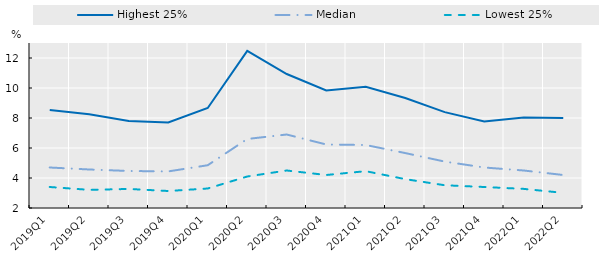
| Category | Highest 25% | Median | Lowest 25% |
|---|---|---|---|
| 2019Q1 | 8.53 | 4.7 | 3.4 |
| 2019Q2 | 8.244 | 4.567 | 3.21 |
| 2019Q3 | 7.8 | 4.468 | 3.27 |
| 2019Q4 | 7.7 | 4.439 | 3.133 |
| 2020Q1 | 8.669 | 4.852 | 3.3 |
| 2020Q2 | 12.479 | 6.602 | 4.1 |
| 2020Q3 | 10.934 | 6.9 | 4.5 |
| 2020Q4 | 9.84 | 6.233 | 4.2 |
| 2021Q1 | 10.082 | 6.2 | 4.456 |
| 2021Q2 | 9.334 | 5.662 | 3.924 |
| 2021Q3 | 8.393 | 5.094 | 3.516 |
| 2021Q4 | 7.772 | 4.7 | 3.4 |
| 2022Q1 | 8.035 | 4.5 | 3.274 |
| 2022Q2 | 8.003 | 4.2 | 3.009 |